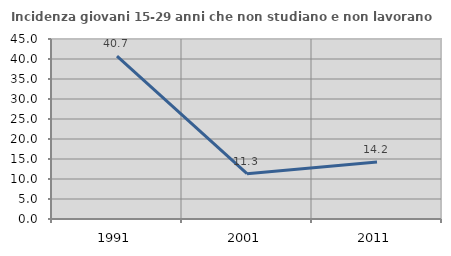
| Category | Incidenza giovani 15-29 anni che non studiano e non lavorano  |
|---|---|
| 1991.0 | 40.709 |
| 2001.0 | 11.331 |
| 2011.0 | 14.238 |